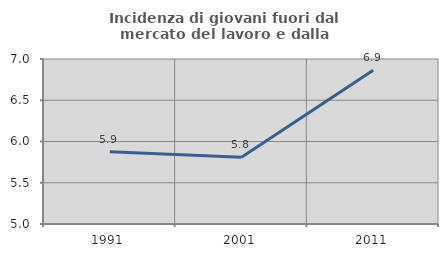
| Category | Incidenza di giovani fuori dal mercato del lavoro e dalla formazione  |
|---|---|
| 1991.0 | 5.875 |
| 2001.0 | 5.808 |
| 2011.0 | 6.865 |